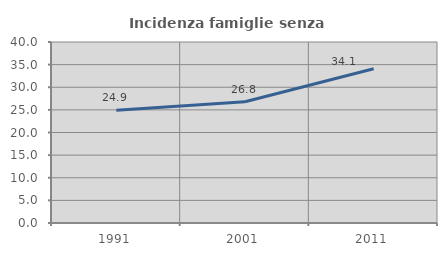
| Category | Incidenza famiglie senza nuclei |
|---|---|
| 1991.0 | 24.901 |
| 2001.0 | 26.797 |
| 2011.0 | 34.093 |